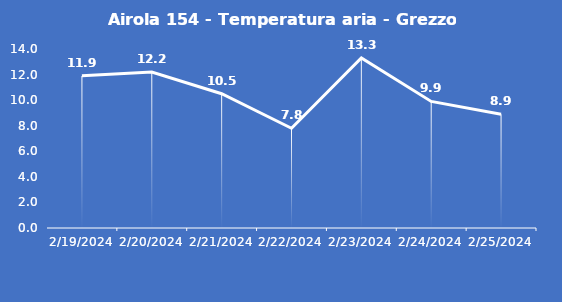
| Category | Airola 154 - Temperatura aria - Grezzo (°C) |
|---|---|
| 2/19/24 | 11.9 |
| 2/20/24 | 12.2 |
| 2/21/24 | 10.5 |
| 2/22/24 | 7.8 |
| 2/23/24 | 13.3 |
| 2/24/24 | 9.9 |
| 2/25/24 | 8.9 |